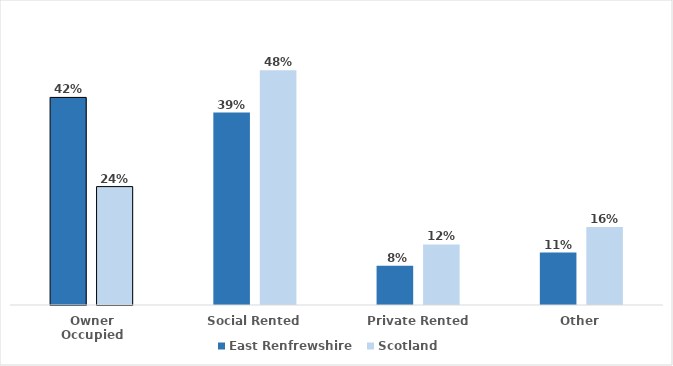
| Category | East Renfrewshire | Scotland |
|---|---|---|
| Owner Occupied | 0.422 | 0.241 |
| Social Rented | 0.392 | 0.477 |
| Private Rented | 0.08 | 0.123 |
| Other | 0.107 | 0.159 |